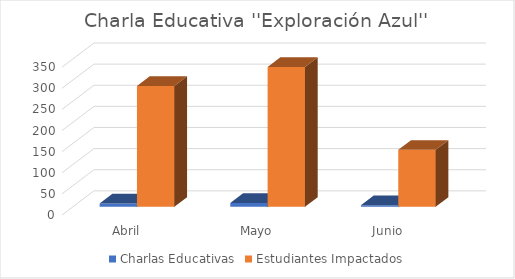
| Category | Charlas Educativas | Estudiantes Impactados |
|---|---|---|
| Abril | 8 | 286 |
| Mayo | 9 | 331 |
| Junio | 4 | 135 |